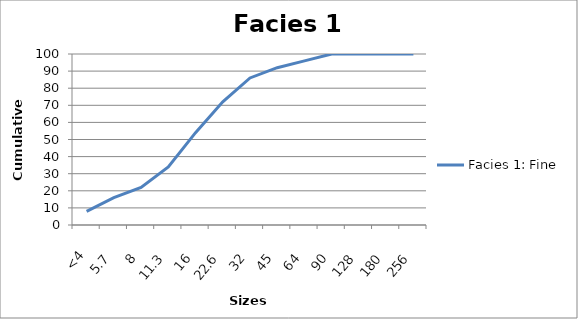
| Category | Facies 1: Fine |
|---|---|
| <4 | 8 |
| 5.7 | 16 |
| 8 | 22 |
| 11.3 | 34 |
| 16 | 54 |
| 22.6 | 72 |
| 32 | 86 |
| 45 | 92 |
| 64 | 96 |
| 90 | 100 |
| 128 | 100 |
| 180 | 100 |
| 256 | 100 |